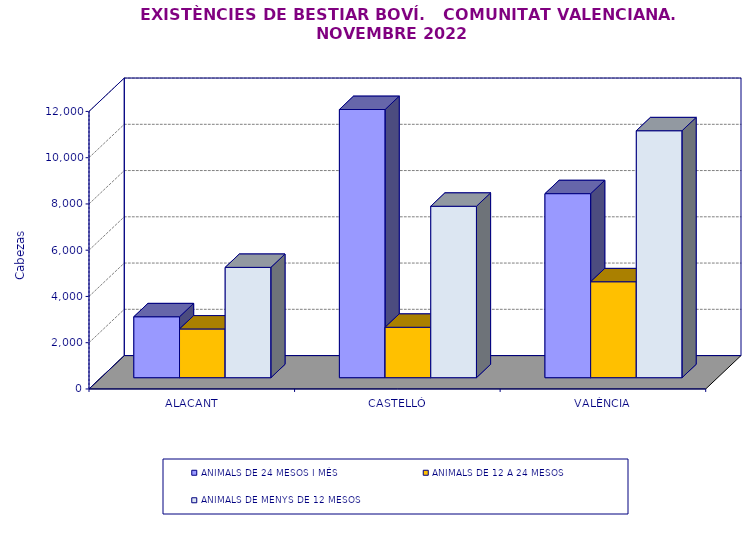
| Category | ANIMALS DE 24 MESOS I MÉS | ANIMALS DE 12 A 24 MESOS | ANIMALS DE MENYS DE 12 MESOS |
|---|---|---|---|
| ALACANT | 2635 | 2107 | 4770 |
| CASTELLÓ | 11596 | 2180 | 7413 |
| VALÈNCIA | 7958 | 4148 | 10678 |